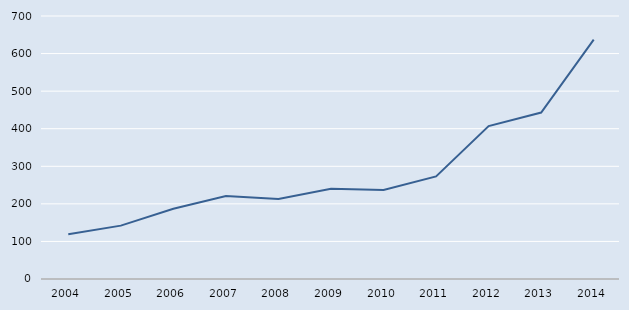
| Category | Series 0 |
|---|---|
| 2004.0 | 119 |
| 2005.0 | 142 |
| 2006.0 | 187 |
| 2007.0 | 221 |
| 2008.0 | 213 |
| 2009.0 | 240 |
| 2010.0 | 237 |
| 2011.0 | 273 |
| 2012.0 | 407 |
| 2013.0 | 443 |
| 2014.0 | 637 |